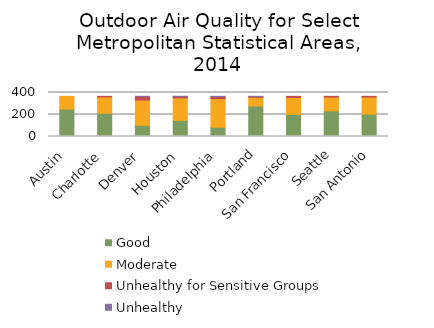
| Category | Good | Moderate | Unhealthy for Sensitive Groups | Unhealthy   |
|---|---|---|---|---|
| Austin | 249 | 116 | 0 | 0 |
| Charlotte | 212 | 148 | 5 | 0 |
| Denver | 102 | 229 | 33 | 1 |
| Houston | 147 | 204 | 13 | 1 |
| Philadelphia | 84 | 260 | 18 | 3 |
| Portland | 277 | 80 | 7 | 1 |
| San Francisco | 200 | 155 | 10 | 0 |
| Seattle | 233 | 125 | 7 | 0 |
| San Antonio | 203 | 156 | 6 | 0 |